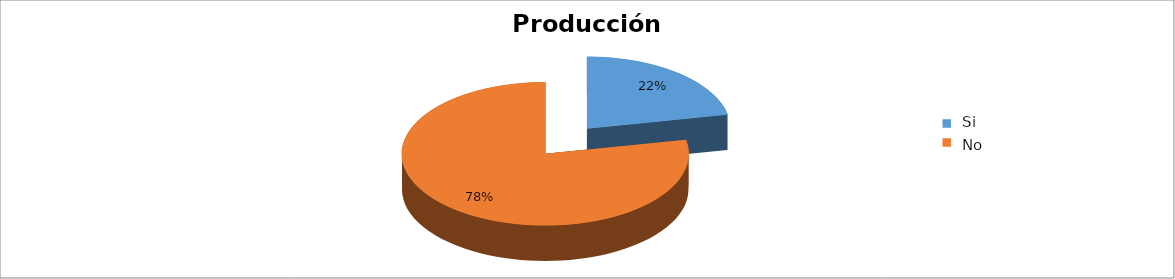
| Category | Series 0 |
|---|---|
| 0 | 0.218 |
| 1 | 0.782 |